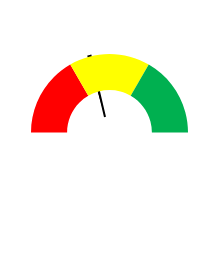
| Category | Series 1 |
|---|---|
| 0 | 26.111 |
| 1 | 1 |
| 2 | 100 |